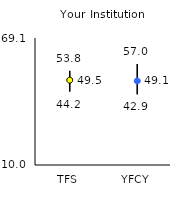
| Category | 25th | 75th | Mean |
|---|---|---|---|
| TFS | 44.2 | 53.8 | 49.49 |
| YFCY | 42.9 | 57 | 49.12 |